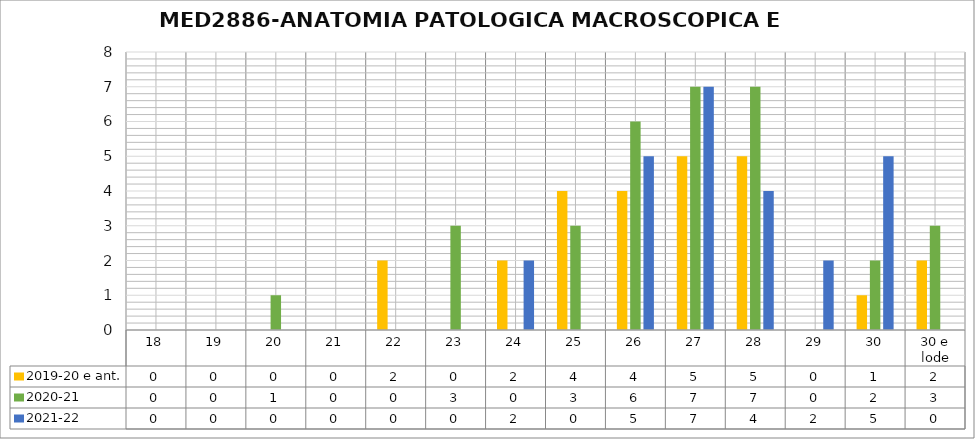
| Category | 2019-20 e ant. | 2020-21 | 2021-22 |
|---|---|---|---|
| 18 | 0 | 0 | 0 |
| 19 | 0 | 0 | 0 |
| 20 | 0 | 1 | 0 |
| 21 | 0 | 0 | 0 |
| 22 | 2 | 0 | 0 |
| 23 | 0 | 3 | 0 |
| 24 | 2 | 0 | 2 |
| 25 | 4 | 3 | 0 |
| 26 | 4 | 6 | 5 |
| 27 | 5 | 7 | 7 |
| 28 | 5 | 7 | 4 |
| 29 | 0 | 0 | 2 |
| 30 | 1 | 2 | 5 |
| 30 e lode | 2 | 3 | 0 |